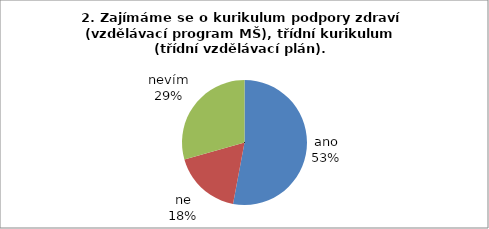
| Category | 2. |
|---|---|
| ano | 18 |
| ne | 6 |
| nevím | 10 |